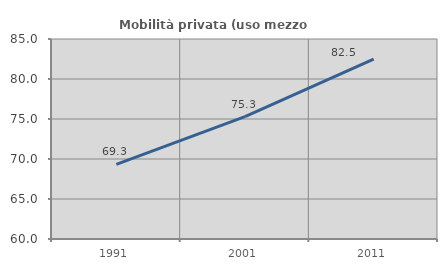
| Category | Mobilità privata (uso mezzo privato) |
|---|---|
| 1991.0 | 69.32 |
| 2001.0 | 75.298 |
| 2011.0 | 82.483 |